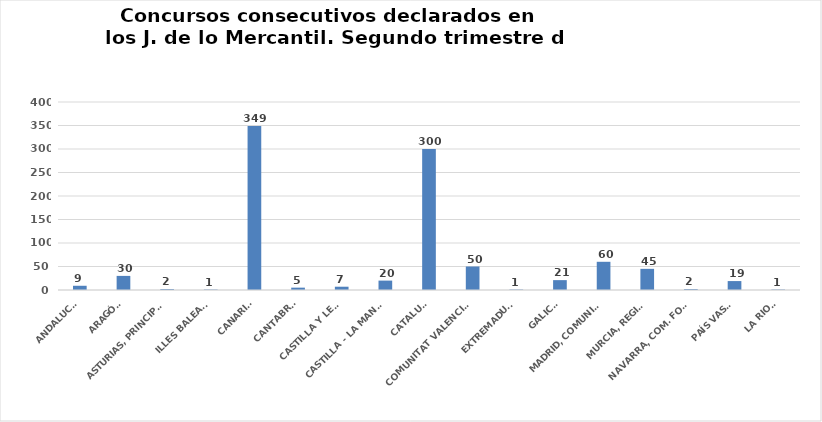
| Category | Series 0 |
|---|---|
| ANDALUCÍA | 9 |
| ARAGÓN | 30 |
| ASTURIAS, PRINCIPADO | 2 |
| ILLES BALEARS | 1 |
| CANARIAS | 349 |
| CANTABRIA | 5 |
| CASTILLA Y LEÓN | 7 |
| CASTILLA - LA MANCHA | 20 |
| CATALUÑA | 300 |
| COMUNITAT VALENCIANA | 50 |
| EXTREMADURA | 1 |
| GALICIA | 21 |
| MADRID, COMUNIDAD | 60 |
| MURCIA, REGIÓN | 45 |
| NAVARRA, COM. FORAL | 2 |
| PAÍS VASCO | 19 |
| LA RIOJA | 1 |